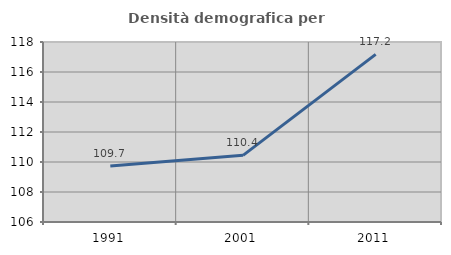
| Category | Densità demografica |
|---|---|
| 1991.0 | 109.737 |
| 2001.0 | 110.443 |
| 2011.0 | 117.176 |